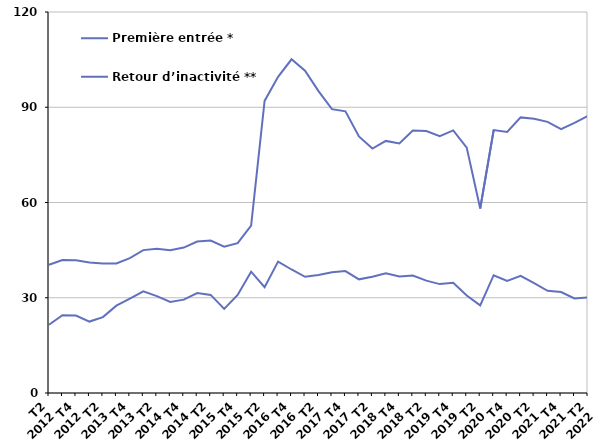
| Category | Première entrée * | Retour d’inactivité ** |
|---|---|---|
| T2
2012 | 21.5 | 40.4 |
| T3
2012 | 24.5 | 41.9 |
| T4
2012 | 24.4 | 41.8 |
| T1
2013 | 22.5 | 41.1 |
| T2
2013 | 23.9 | 40.8 |
| T3
2013 | 27.5 | 40.8 |
| T4
2013 | 29.7 | 42.5 |
| T1
2014 | 32 | 45 |
| T2
2014 | 30.5 | 45.4 |
| T3
2014 | 28.7 | 45 |
| T4
2014 | 29.4 | 45.8 |
| T1
2015 | 31.5 | 47.7 |
| T2
2015 | 30.9 | 48 |
| T3
2015 | 26.5 | 46.1 |
| T4
2015 | 30.9 | 47.2 |
| T1
2016 | 38.2 | 52.7 |
| T2
2016 | 33.3 | 92 |
| T3
2016 | 41.4 | 99.6 |
| T4
2016 | 38.9 | 105.1 |
| T1
2017 | 36.6 | 101.5 |
| T2
2017 | 37.2 | 95.1 |
| T3
2017 | 38 | 89.4 |
| T4
2017 | 38.4 | 88.7 |
| T1
2018 | 35.8 | 80.8 |
| T2
2018 | 36.6 | 77 |
| T3
2018 | 37.7 | 79.4 |
| T4
2018 | 36.7 | 78.6 |
| T1
2019 | 37 | 82.7 |
| T2
2019 | 35.4 | 82.5 |
| T3
2019 | 34.3 | 80.9 |
| T4
2019 | 34.7 | 82.7 |
| T1
2020 | 30.7 | 77.3 |
| T2
2020 | 27.6 | 58.1 |
| T3
2020 | 37.1 | 82.8 |
| T4
2020 | 35.3 | 82.2 |
| T1
2021 | 36.9 | 86.8 |
| T2
2021 | 34.6 | 86.4 |
| T3
2021 | 32.2 | 85.4 |
| T4
2021 | 31.8 | 83.1 |
| T1
2022 | 29.8 | 85.1 |
| T2
2022 | 30.1 | 87.3 |